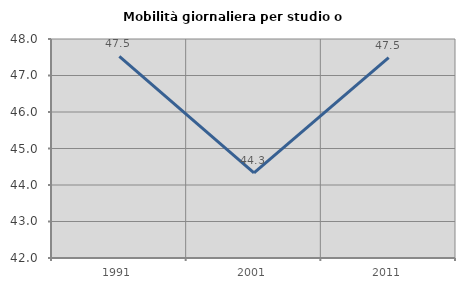
| Category | Mobilità giornaliera per studio o lavoro |
|---|---|
| 1991.0 | 47.526 |
| 2001.0 | 44.332 |
| 2011.0 | 47.492 |